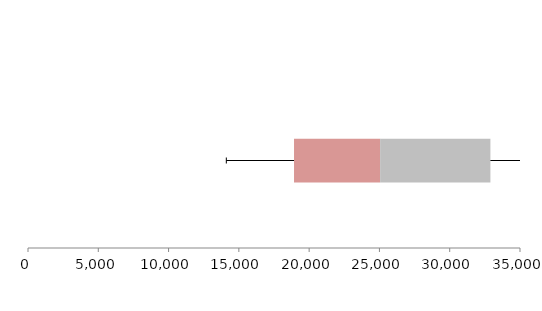
| Category | Series 1 | Series 2 | Series 3 |
|---|---|---|---|
| 0 | 18924.059 | 6125.249 | 7844.98 |